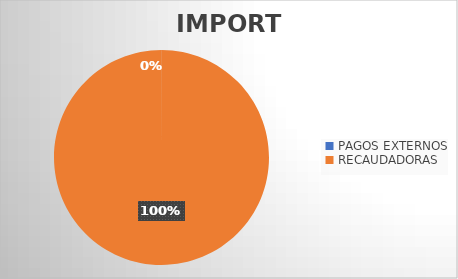
| Category | IMPORTE |
|---|---|
| PAGOS EXTERNOS | 282670.74 |
| RECAUDADORAS | 1348527360.66 |